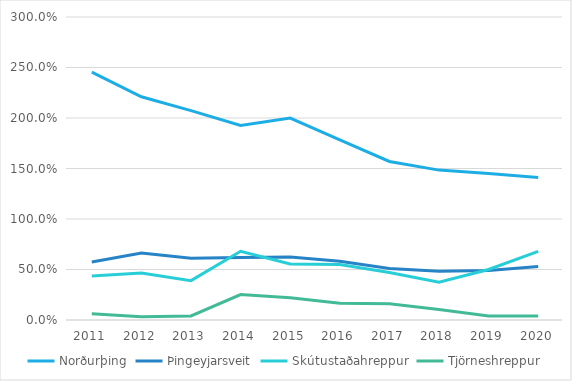
| Category | Norðurþing | Þingeyjarsveit | Skútustaðahreppur | Tjörneshreppur |
|---|---|---|---|---|
| 2011.0 | 2.453 | 0.574 | 0.437 | 0.062 |
| 2012.0 | 2.21 | 0.663 | 0.466 | 0.033 |
| 2013.0 | 2.073 | 0.61 | 0.39 | 0.041 |
| 2014.0 | 1.927 | 0.619 | 0.68 | 0.252 |
| 2015.0 | 1.999 | 0.624 | 0.555 | 0.22 |
| 2016.0 | 1.784 | 0.583 | 0.549 | 0.166 |
| 2017.0 | 1.57 | 0.51 | 0.47 | 0.16 |
| 2018.0 | 1.484 | 0.483 | 0.374 | 0.105 |
| 2019.0 | 1.45 | 0.49 | 0.5 | 0.04 |
| 2020.0 | 1.41 | 0.53 | 0.68 | 0.04 |